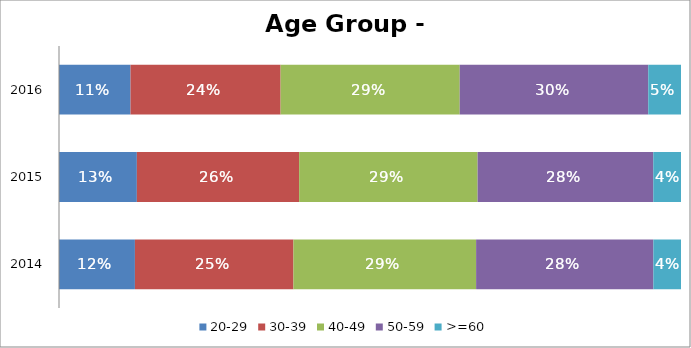
| Category | 20-29 | 30-39 | 40-49 | 50-59 | >=60 |
|---|---|---|---|---|---|
| 2014.0 | 0.122 | 0.255 | 0.294 | 0.285 | 0.044 |
| 2015.0 | 0.125 | 0.261 | 0.287 | 0.282 | 0.045 |
| 2016.0 | 0.115 | 0.241 | 0.288 | 0.303 | 0.053 |